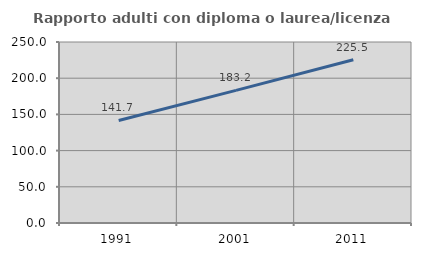
| Category | Rapporto adulti con diploma o laurea/licenza media  |
|---|---|
| 1991.0 | 141.656 |
| 2001.0 | 183.213 |
| 2011.0 | 225.491 |